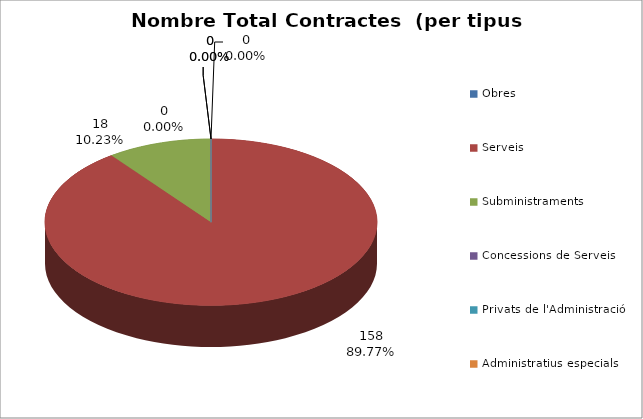
| Category | Nombre Total Contractes |
|---|---|
| Obres | 0 |
| Serveis | 158 |
| Subministraments | 18 |
| Concessions de Serveis | 0 |
| Privats de l'Administració | 0 |
| Administratius especials | 0 |